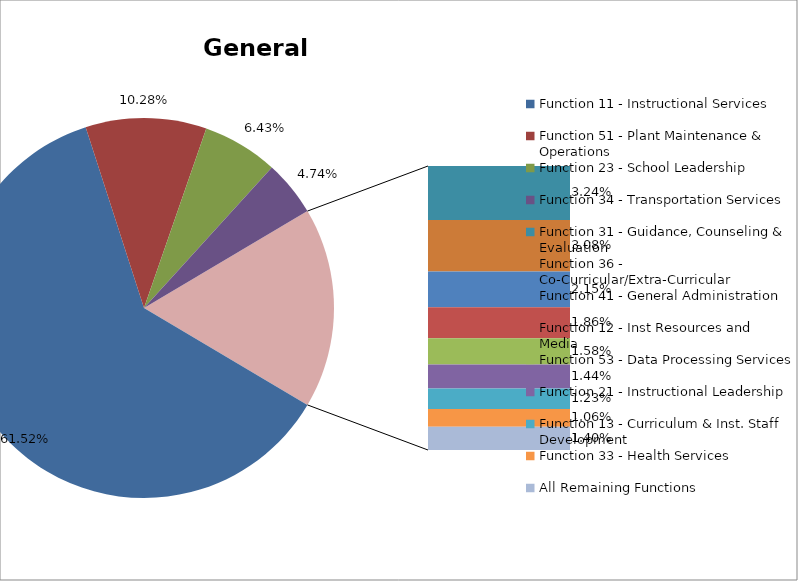
| Category | Series 0 |
|---|---|
| Function 11 - Instructional Services | 0.615 |
| Function 51 - Plant Maintenance & Operations | 0.103 |
| Function 23 - School Leadership | 0.064 |
| Function 34 - Transportation Services | 0.047 |
| Function 31 - Guidance, Counseling & Evaluation | 0.032 |
| Function 36 - Co-Curricular/Extra-Curricular | 0.031 |
| Function 41 - General Administration | 0.021 |
| Function 12 - Inst Resources and Media | 0.019 |
| Function 53 - Data Processing Services | 0.016 |
| Function 21 - Instructional Leadership | 0.014 |
| Function 13 - Curriculum & Inst. Staff Development | 0.012 |
| Function 33 - Health Services | 0.011 |
| All Remaining Functions | 0.014 |